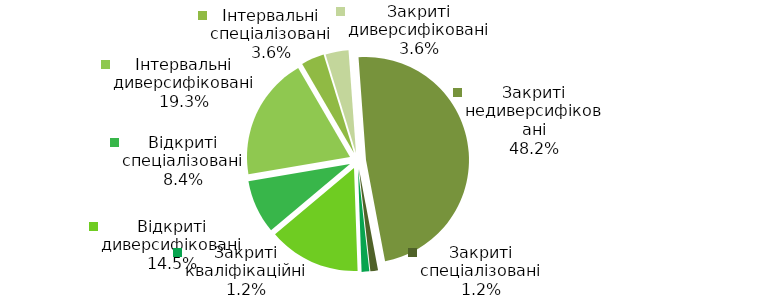
| Category | Series 0 |
|---|---|
| Відкриті диверсифіковані | 12 |
| Відкриті спеціалізовані | 7 |
| Інтервальні диверсифіковані | 16 |
| Інтервальні спеціалізовані | 3 |
| Закриті диверсифіковані | 3 |
| Закриті недиверсифіковані | 40 |
| Закриті спеціалізовані | 1 |
| Закриті кваліфікаційні | 1 |